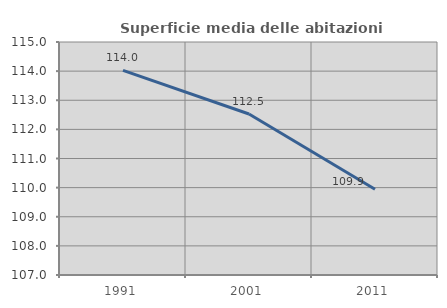
| Category | Superficie media delle abitazioni occupate |
|---|---|
| 1991.0 | 114.029 |
| 2001.0 | 112.527 |
| 2011.0 | 109.944 |